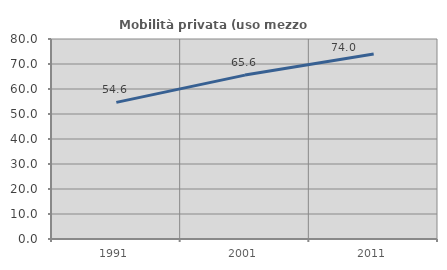
| Category | Mobilità privata (uso mezzo privato) |
|---|---|
| 1991.0 | 54.645 |
| 2001.0 | 65.56 |
| 2011.0 | 73.993 |